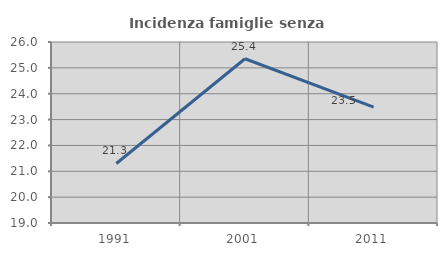
| Category | Incidenza famiglie senza nuclei |
|---|---|
| 1991.0 | 21.302 |
| 2001.0 | 25.352 |
| 2011.0 | 23.485 |